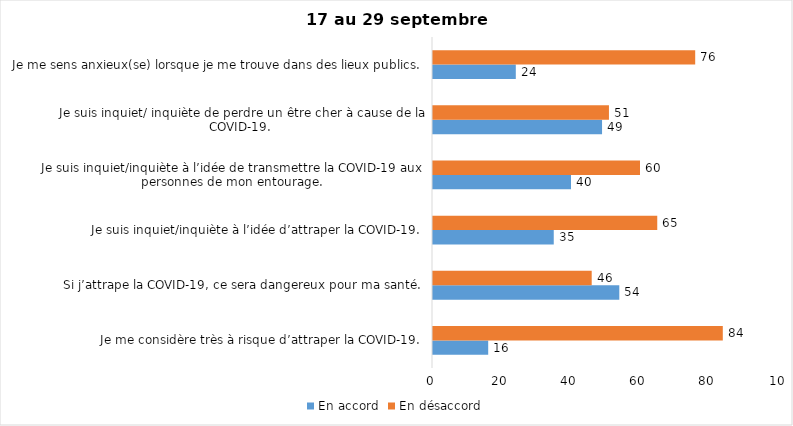
| Category | En accord | En désaccord |
|---|---|---|
| Je me considère très à risque d’attraper la COVID-19. | 16 | 84 |
| Si j’attrape la COVID-19, ce sera dangereux pour ma santé. | 54 | 46 |
| Je suis inquiet/inquiète à l’idée d’attraper la COVID-19. | 35 | 65 |
| Je suis inquiet/inquiète à l’idée de transmettre la COVID-19 aux personnes de mon entourage. | 40 | 60 |
| Je suis inquiet/ inquiète de perdre un être cher à cause de la COVID-19. | 49 | 51 |
| Je me sens anxieux(se) lorsque je me trouve dans des lieux publics. | 24 | 76 |